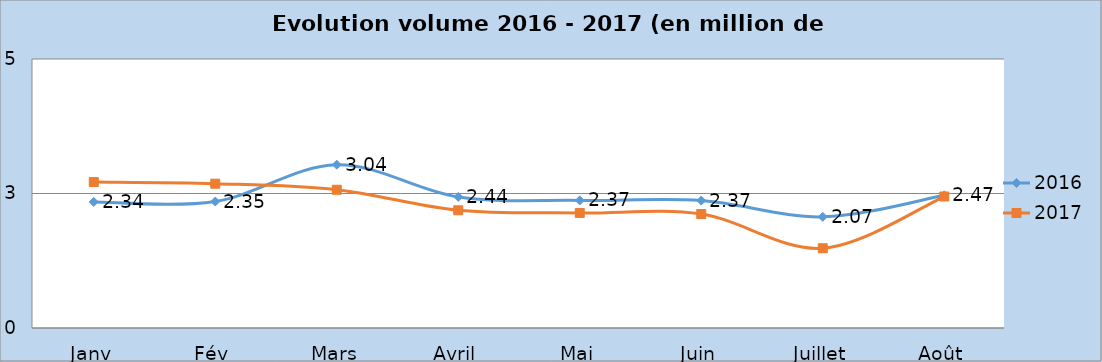
| Category | 2016 | 2017 |
|---|---|---|
| Janv | 2.343 | 2.713 |
| Fév | 2.351 | 2.682 |
| Mars | 3.036 | 2.569 |
| Avril | 2.436 | 2.188 |
| Mai | 2.371 | 2.139 |
| Juin | 2.369 | 2.118 |
| Juillet | 2.066 | 1.482 |
| Août | 2.466 | 2.444 |